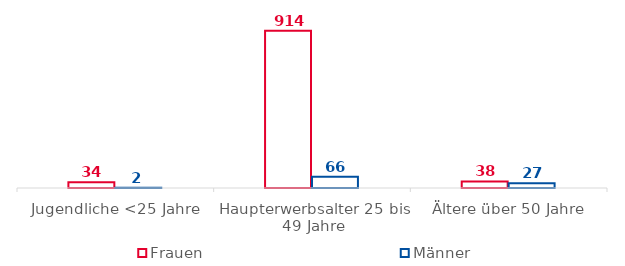
| Category | Frauen | Männer |
|---|---|---|
| Jugendliche <25 Jahre | 34 | 2 |
| Haupterwerbsalter 25 bis 49 Jahre | 914 | 66 |
| Ältere über 50 Jahre | 38 | 27 |